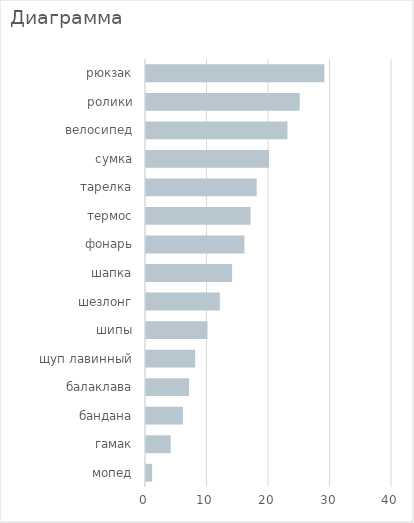
| Category | Series 0 |
|---|---|
| мопед | 1 |
| гамак | 4 |
| бандана | 6 |
| балаклава | 7 |
| щуп лавинный | 8 |
| шипы | 10 |
| шезлонг | 12 |
| шапка | 14 |
| фонарь | 16 |
| термос | 17 |
| тарелка | 18 |
| сумка | 20 |
| велосипед | 23 |
| ролики | 25 |
| рюкзак | 29 |